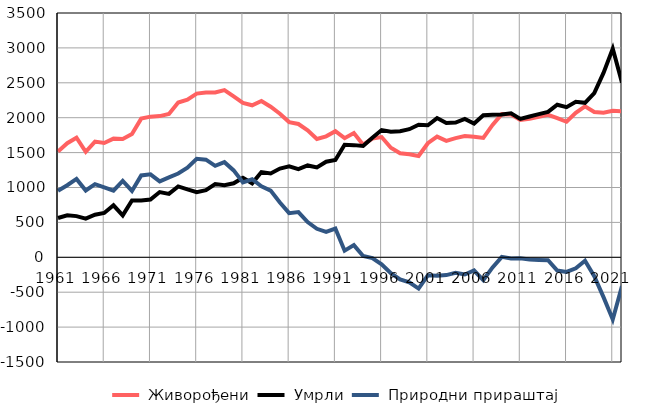
| Category |  Живорођени |  Умрли |  Природни прираштај |
|---|---|---|---|
| 1961.0 | 1517 | 563 | 954 |
| 1962.0 | 1634 | 602 | 1032 |
| 1963.0 | 1713 | 590 | 1123 |
| 1964.0 | 1512 | 555 | 957 |
| 1965.0 | 1658 | 610 | 1048 |
| 1966.0 | 1637 | 635 | 1002 |
| 1967.0 | 1700 | 745 | 955 |
| 1968.0 | 1694 | 600 | 1094 |
| 1969.0 | 1765 | 814 | 951 |
| 1970.0 | 1987 | 814 | 1173 |
| 1971.0 | 2015 | 827 | 1188 |
| 1972.0 | 2023 | 935 | 1088 |
| 1973.0 | 2054 | 909 | 1145 |
| 1974.0 | 2217 | 1016 | 1201 |
| 1975.0 | 2257 | 972 | 1285 |
| 1976.0 | 2345 | 933 | 1412 |
| 1977.0 | 2361 | 962 | 1399 |
| 1978.0 | 2361 | 1050 | 1311 |
| 1979.0 | 2395 | 1032 | 1363 |
| 1980.0 | 2305 | 1060 | 1245 |
| 1981.0 | 2212 | 1140 | 1072 |
| 1982.0 | 2178 | 1060 | 1118 |
| 1983.0 | 2239 | 1221 | 1018 |
| 1984.0 | 2157 | 1201 | 956 |
| 1985.0 | 2057 | 1272 | 785 |
| 1986.0 | 1937 | 1304 | 633 |
| 1987.0 | 1910 | 1262 | 648 |
| 1988.0 | 1820 | 1316 | 504 |
| 1989.0 | 1696 | 1288 | 408 |
| 1990.0 | 1733 | 1369 | 364 |
| 1991.0 | 1806 | 1394 | 412 |
| 1992.0 | 1707 | 1612 | 95 |
| 1993.0 | 1781 | 1607 | 174 |
| 1994.0 | 1613 | 1595 | 18 |
| 1995.0 | 1702 | 1714 | -12 |
| 1996.0 | 1723 | 1823 | -100 |
| 1997.0 | 1570 | 1799 | -229 |
| 1998.0 | 1490 | 1807 | -317 |
| 1999.0 | 1475 | 1835 | -360 |
| 2000.0 | 1452 | 1900 | -448 |
| 2001.0 | 1634 | 1892 | -258 |
| 2002.0 | 1729 | 1995 | -266 |
| 2003.0 | 1668 | 1923 | -255 |
| 2004.0 | 1708 | 1930 | -222 |
| 2005.0 | 1736 | 1983 | -247 |
| 2006.0 | 1728 | 1917 | -189 |
| 2007.0 | 1710 | 2036 | -326 |
| 2008.0 | 1896 | 2041 | -145 |
| 2009.0 | 2051 | 2045 | 6 |
| 2010.0 | 2045 | 2062 | -17 |
| 2011.0 | 1968 | 1983 | -15 |
| 2012.0 | 1986 | 2018 | -32 |
| 2013.0 | 2014 | 2052 | -38 |
| 2014.0 | 2041 | 2083 | -42 |
| 2015.0 | 1995 | 2185 | -190 |
| 2016.0 | 1942 | 2151 | -209 |
| 2017.0 | 2071 | 2228 | -157 |
| 2018.0 | 2163 | 2213 | -50 |
| 2019.0 | 2081 | 2351 | -270 |
| 2020.0 | 2071 | 2642 | -571 |
| 2021.0 | 2100 | 2990 | -890 |
| 2022.0 | 2091 | 2502 | -411 |